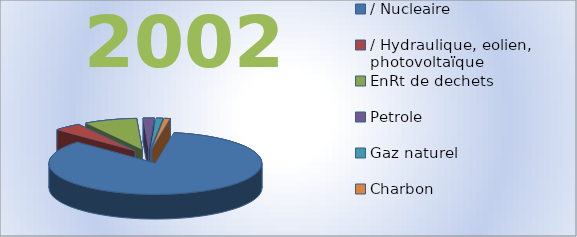
| Category | 2002 |
|---|---|
| / Nucleaire | 113.8 |
| / Hydraulique, eolien, photovoltaïque | 5.7 |
| EnRt de dechets | 10.9 |
| Petrole | 2.3 |
| Gaz naturel | 1.4 |
| Charbon | 1.2 |